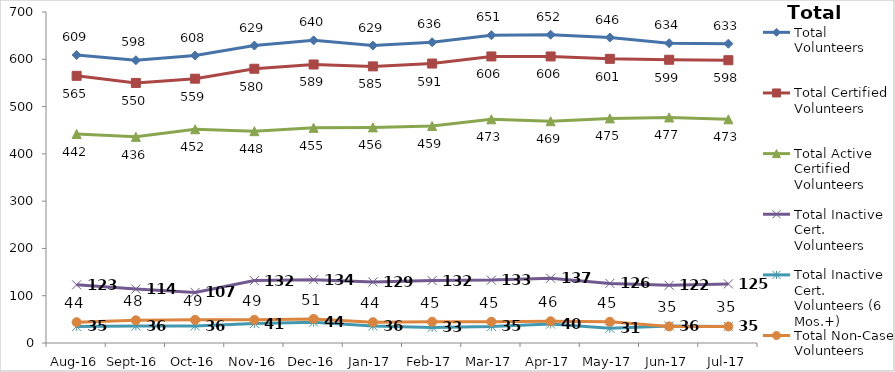
| Category | Total Volunteers | Total Certified Volunteers | Total Active Certified Volunteers | Total Inactive Cert. Volunteers | Total Inactive Cert. Volunteers (6 Mos.+) | Total Non-Case Volunteers |
|---|---|---|---|---|---|---|
| Aug-16 | 609 | 565 | 442 | 123 | 35 | 44 |
| Sep-16 | 598 | 550 | 436 | 114 | 36 | 48 |
| Oct-16 | 608 | 559 | 452 | 107 | 36 | 49 |
| Nov-16 | 629 | 580 | 448 | 132 | 41 | 49 |
| Dec-16 | 640 | 589 | 455 | 134 | 44 | 51 |
| Jan-17 | 629 | 585 | 456 | 129 | 36 | 44 |
| Feb-17 | 636 | 591 | 459 | 132 | 33 | 45 |
| Mar-17 | 651 | 606 | 473 | 133 | 35 | 45 |
| Apr-17 | 652 | 606 | 469 | 137 | 40 | 46 |
| May-17 | 646 | 601 | 475 | 126 | 31 | 45 |
| Jun-17 | 634 | 599 | 477 | 122 | 36 | 35 |
| Jul-17 | 633 | 598 | 473 | 125 | 35 | 35 |